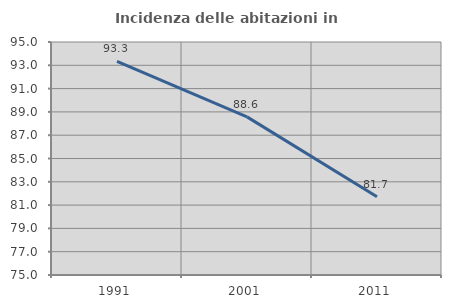
| Category | Incidenza delle abitazioni in proprietà  |
|---|---|
| 1991.0 | 93.333 |
| 2001.0 | 88.571 |
| 2011.0 | 81.72 |